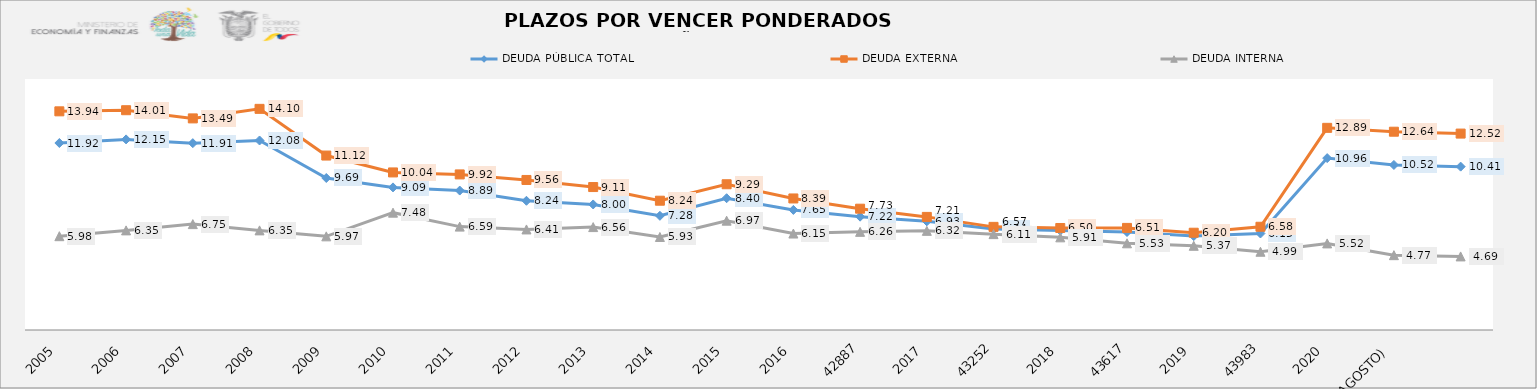
| Category | DEUDA PÚBLICA TOTAL | DEUDA EXTERNA  | DEUDA INTERNA |
|---|---|---|---|
| 2005 | 11.92 | 13.939 | 5.98 |
| 2006 | 12.15 | 14.01 | 6.35 |
| 2007 | 11.91 | 13.489 | 6.75 |
| 2008 | 12.08 | 14.097 | 6.35 |
| 2009 | 9.69 | 11.12 | 5.97 |
| 2010 | 9.09 | 10.045 | 7.48 |
| 2011 | 8.889 | 9.918 | 6.59 |
| 2012 | 8.237 | 9.564 | 6.41 |
| 2013 | 8.003 | 9.112 | 6.56 |
| 2014 | 7.278 | 8.241 | 5.93 |
| 2015 | 8.401 | 9.29 | 6.969 |
| 2016 | 7.655 | 8.385 | 6.149 |
| 42887 | 7.224 | 7.733 | 6.257 |
| 2017 | 6.927 | 7.21 | 6.32 |
| 43252 | 6.439 | 6.574 | 6.111 |
| 2018 | 6.337 | 6.503 | 5.906 |
| 43617 | 6.246 | 6.509 | 5.526 |
| 2019 | 5.988 | 6.201 | 5.368 |
| 43983 | 6.152 | 6.581 | 4.989 |
| 2020 | 10.957 | 12.887 | 5.519 |
| 2021 (AGOSTO) | 10.52 | 12.64 | 4.77 |